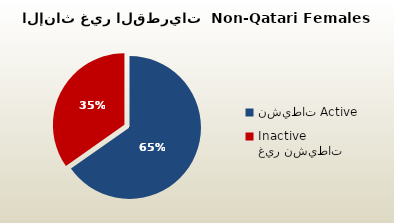
| Category | الاناث غير القطريات  Non-Qatari Females |
|---|---|
| نشيطات Active | 279137 |
| غير نشيطات Inactive | 148562 |